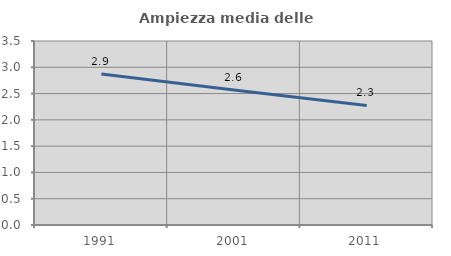
| Category | Ampiezza media delle famiglie |
|---|---|
| 1991.0 | 2.873 |
| 2001.0 | 2.569 |
| 2011.0 | 2.275 |